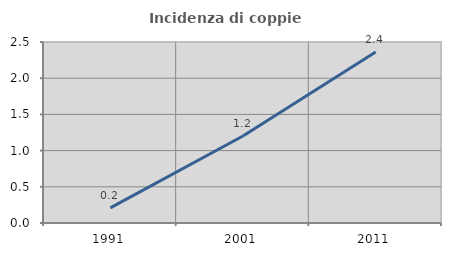
| Category | Incidenza di coppie miste |
|---|---|
| 1991.0 | 0.209 |
| 2001.0 | 1.202 |
| 2011.0 | 2.362 |